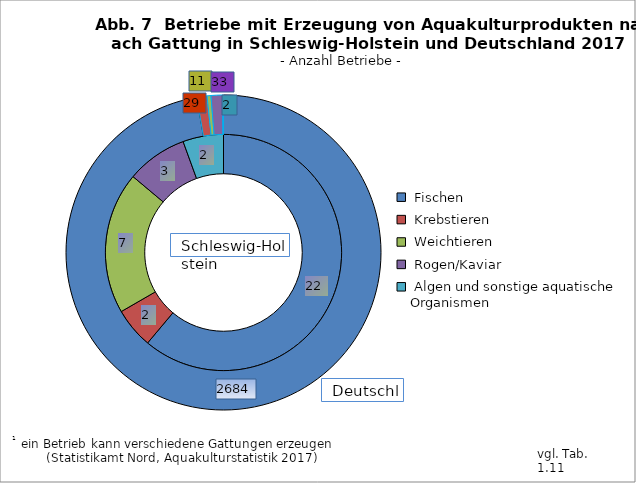
| Category | Schleswig-Holstein | Deutschland                                        |
|---|---|---|
|  Fischen                           | 22 | 2684 |
|  Krebstieren                          | 2 | 29 |
|  Weichtieren                                     | 7 | 11 |
|  Rogen/Kaviar                                    | 3 | 33 |
|  Algen und sonstige aquatische Organismen      | 2 | 2 |